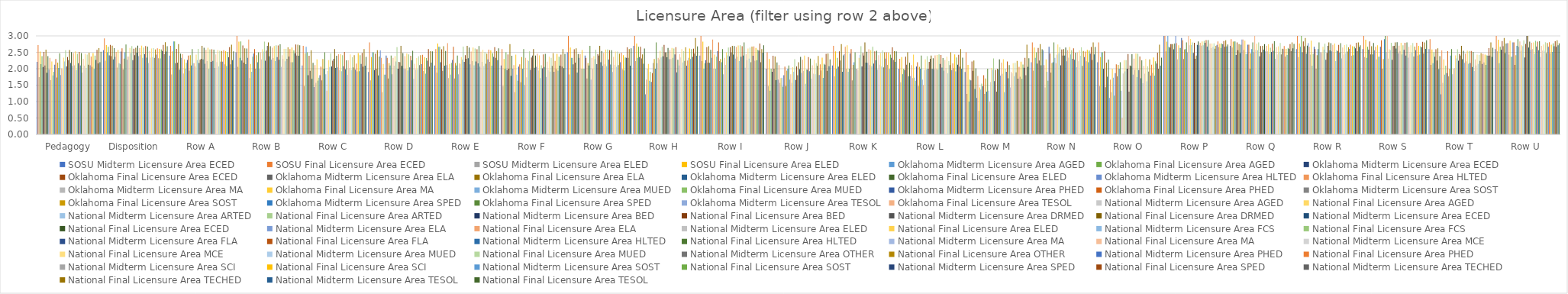
| Category | SOSU | Oklahoma | National |
|---|---|---|---|
| Pedagogy | 2.52 | 2.013 | 2.515 |
| Disposition | 2.721 | 2.375 | 2.686 |
| Row A | 2.529 | 2.167 | 2.528 |
| Row B | 2.824 | 2.5 | 2.717 |
| Row C | 2.471 | 1.333 | 2.358 |
| Row D | 2.353 | 2.333 | 2.528 |
| Row E | 2.765 | 2.167 | 2.623 |
| Row F | 2.294 | 2.333 | 2.453 |
| Row G | 2.647 | 2.333 | 2.623 |
| Row H | 2.765 | 2.333 | 2.679 |
| Row I | 2.824 | 2.333 | 2.717 |
| Row J | 2.294 | 1.833 | 2.283 |
| Row K | 2.529 | 2 | 2.528 |
| Row L | 2.353 | 1.5 | 2.34 |
| Row M | 2.118 | 1 | 2.321 |
| Row N | 2.647 | 2.167 | 2.66 |
| Row O | 2.353 | 0.5 | 2.34 |
| Row P | 2.824 | 3 | 2.736 |
| Row Q | 2.824 | 3 | 2.755 |
| Row R | 2.765 | 2.5 | 2.717 |
| Row S | 2.882 | 3 | 2.868 |
| Row T | 2.588 | 2 | 2.642 |
| Row U | 2.882 | 2.833 | 2.774 |